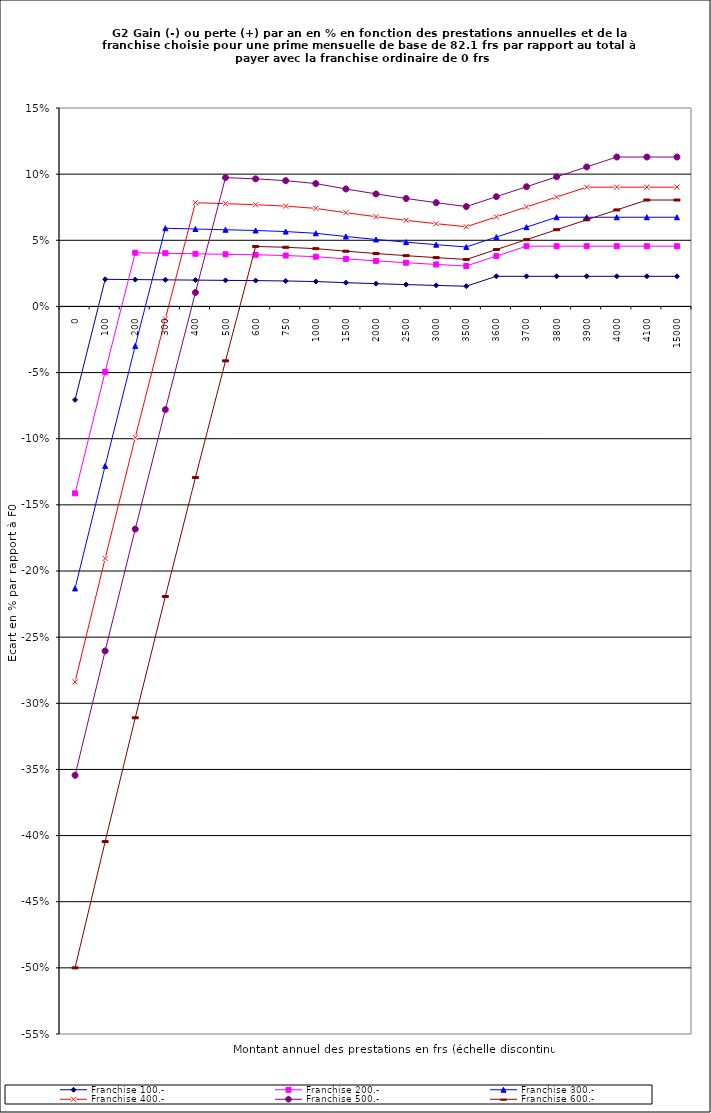
| Category | Franchise 100.- | Franchise 200.- | Franchise 300.- | Franchise 400.- | Franchise 500.- | Franchise 600.- |
|---|---|---|---|---|---|---|
| 0.0 | -0.071 | -0.141 | -0.213 | -0.284 | -0.354 | -0.5 |
| 100.0 | 0.02 | -0.049 | -0.121 | -0.191 | -0.26 | -0.405 |
| 200.0 | 0.02 | 0.041 | -0.03 | -0.099 | -0.168 | -0.311 |
| 300.0 | 0.02 | 0.04 | 0.059 | -0.009 | -0.078 | -0.219 |
| 400.0 | 0.02 | 0.04 | 0.059 | 0.078 | 0.011 | -0.129 |
| 500.0 | 0.02 | 0.039 | 0.058 | 0.078 | 0.097 | -0.041 |
| 600.0 | 0.02 | 0.039 | 0.057 | 0.077 | 0.096 | 0.045 |
| 750.0 | 0.019 | 0.038 | 0.057 | 0.076 | 0.095 | 0.045 |
| 1000.0 | 0.019 | 0.038 | 0.055 | 0.074 | 0.093 | 0.044 |
| 1500.0 | 0.018 | 0.036 | 0.053 | 0.071 | 0.089 | 0.042 |
| 2000.0 | 0.017 | 0.034 | 0.051 | 0.068 | 0.085 | 0.04 |
| 2500.0 | 0.017 | 0.033 | 0.049 | 0.065 | 0.082 | 0.038 |
| 3000.0 | 0.016 | 0.032 | 0.047 | 0.063 | 0.078 | 0.037 |
| 3500.0 | 0.015 | 0.031 | 0.045 | 0.06 | 0.075 | 0.036 |
| 3600.0 | 0.023 | 0.038 | 0.052 | 0.068 | 0.083 | 0.043 |
| 3700.0 | 0.023 | 0.046 | 0.06 | 0.075 | 0.09 | 0.05 |
| 3800.0 | 0.023 | 0.046 | 0.067 | 0.083 | 0.098 | 0.058 |
| 3900.0 | 0.023 | 0.046 | 0.067 | 0.09 | 0.105 | 0.065 |
| 4000.0 | 0.023 | 0.046 | 0.067 | 0.09 | 0.113 | 0.073 |
| 4100.0 | 0.023 | 0.046 | 0.067 | 0.09 | 0.113 | 0.08 |
| 15000.0 | 0.023 | 0.046 | 0.067 | 0.09 | 0.113 | 0.08 |